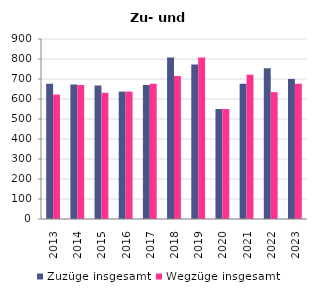
| Category | Zuzüge insgesamt | Wegzüge insgesamt |
|---|---|---|
| 2013.0 | 676 | 622 |
| 2014.0 | 673 | 670 |
| 2015.0 | 667 | 631 |
| 2016.0 | 637 | 637 |
| 2017.0 | 670 | 676 |
| 2018.0 | 808 | 715 |
| 2019.0 | 772 | 808 |
| 2020.0 | 550 | 550 |
| 2021.0 | 676 | 721 |
| 2022.0 | 754 | 634 |
| 2023.0 | 700 | 676 |